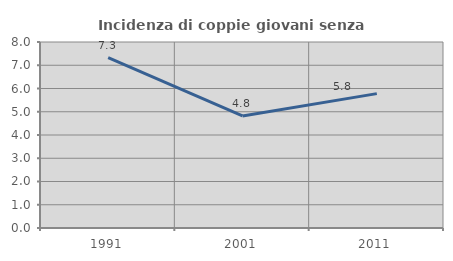
| Category | Incidenza di coppie giovani senza figli |
|---|---|
| 1991.0 | 7.323 |
| 2001.0 | 4.819 |
| 2011.0 | 5.78 |